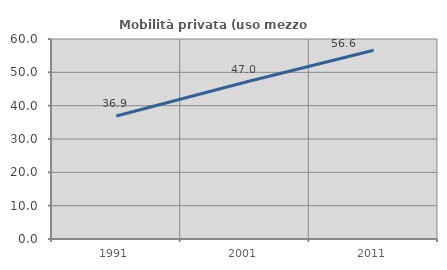
| Category | Mobilità privata (uso mezzo privato) |
|---|---|
| 1991.0 | 36.89 |
| 2001.0 | 47.033 |
| 2011.0 | 56.616 |